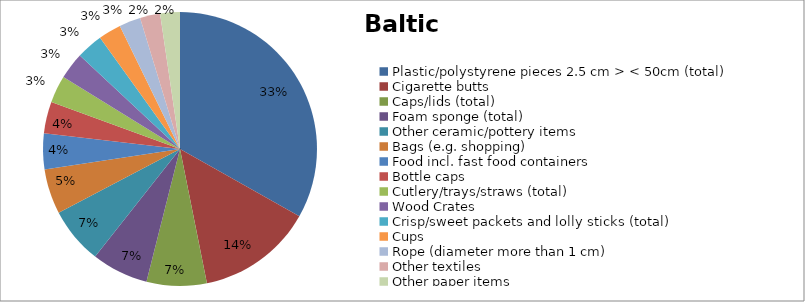
| Category | Series 0 |
|---|---|
| Plastic/polystyrene pieces 2.5 cm > < 50cm (total) | 0.243 |
| Cigarette butts | 0.1 |
| Caps/lids (total) | 0.052 |
| Foam sponge (total) | 0.049 |
| Other ceramic/pottery items | 0.049 |
| Bags (e.g. shopping) | 0.039 |
| Food incl. fast food containers | 0.031 |
| Bottle caps | 0.027 |
| Cutlery/trays/straws (total) | 0.024 |
| Wood Crates | 0.023 |
| Crisp/sweet packets and lolly sticks (total) | 0.023 |
| Cups | 0.02 |
| Rope (diameter more than 1 cm) | 0.019 |
| Other textiles | 0.017 |
| Other paper items | 0.017 |